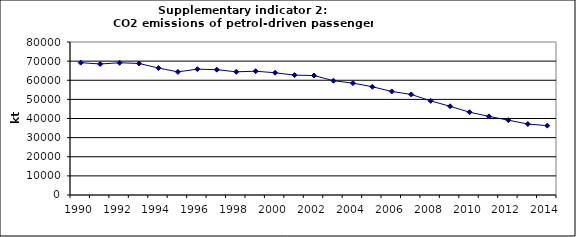
| Category | CO2 emissions of petrol-driven passenger cars, kt |
|---|---|
| 1990 | 69177.59 |
| 1991 | 68505.485 |
| 1992 | 69145.021 |
| 1993 | 68771.268 |
| 1994 | 66389.849 |
| 1995 | 64372.538 |
| 1996 | 65810.82 |
| 1997 | 65525.824 |
| 1998 | 64412.549 |
| 1999 | 64714.9 |
| 2000 | 63921.902 |
| 2001 | 62682.387 |
| 2002 | 62475.483 |
| 2003 | 59760.649 |
| 2004 | 58497.452 |
| 2005 | 56603.667 |
| 2006 | 54134.77 |
| 2007 | 52580.386 |
| 2008 | 49217.43 |
| 2009 | 46387.458 |
| 2010 | 43287.879 |
| 2011 | 41100.717 |
| 2012 | 39129.57 |
| 2013 | 37111.985 |
| 2014 | 36256.954 |